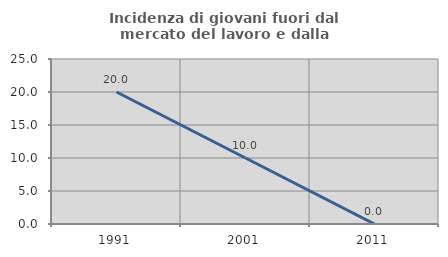
| Category | Incidenza di giovani fuori dal mercato del lavoro e dalla formazione  |
|---|---|
| 1991.0 | 20 |
| 2001.0 | 10 |
| 2011.0 | 0 |